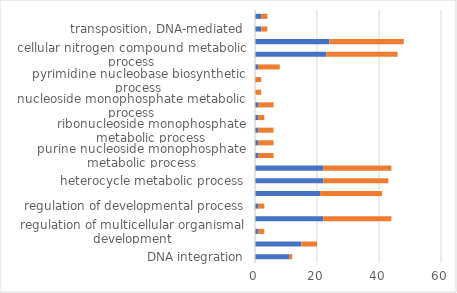
| Category | up | down |
|---|---|---|
| DNA integration | 11 | 1 |
| DNA metabolic process | 15 | 5 |
| regulation of multicellular organismal development | 1 | 2 |
| cellular aromatic compound metabolic process | 22 | 22 |
| regulation of developmental process | 1 | 2 |
| nucleobase-containing compound metabolic process | 21 | 20 |
| heterocycle metabolic process | 22 | 21 |
| organic cyclic compound metabolic process | 22 | 22 |
| purine nucleoside monophosphate metabolic process | 1 | 5 |
| purine ribonucleoside monophosphate metabolic process | 1 | 5 |
| ribonucleoside monophosphate metabolic process | 1 | 5 |
| tissue development | 1 | 2 |
| nucleoside monophosphate metabolic process | 1 | 5 |
| pyrimidine nucleobase metabolic process | 0 | 2 |
| pyrimidine nucleobase biosynthetic process | 0 | 2 |
| nucleobase-containing small molecule metabolic process | 1 | 7 |
| cellular nitrogen compound metabolic process | 23 | 23 |
| nitrogen compound metabolic process | 24 | 24 |
| transposition, DNA-mediated | 2 | 2 |
| transposition | 2 | 2 |